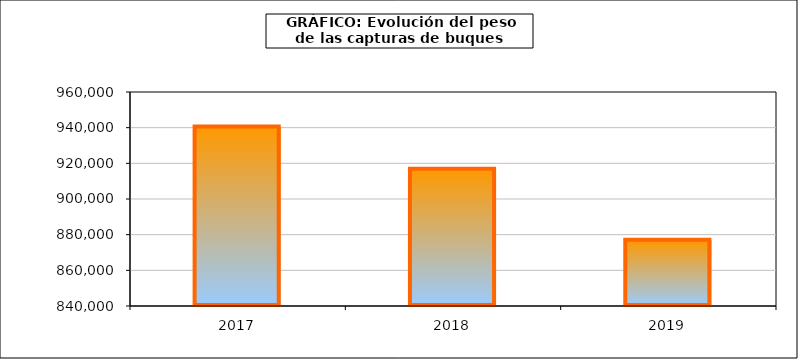
| Category | Series1 |
|---|---|
| 2017.0 | 940633.127 |
| 2018.0 | 917012.01 |
| 2019.0 | 877211.749 |